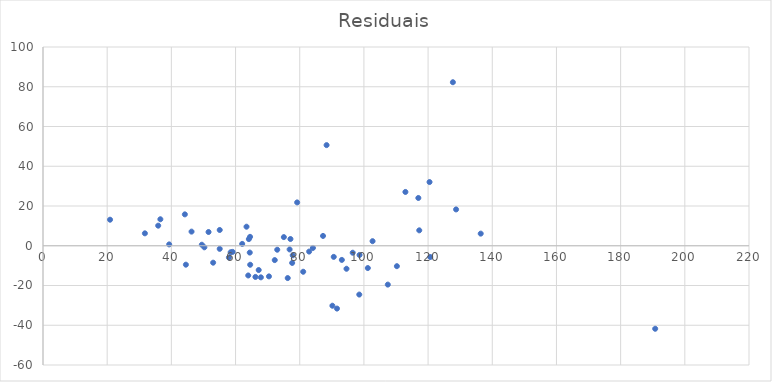
| Category | Residuais |
|---|---|
| 55.066188699001174 | -1.566 |
| 63.956094930219045 | -14.956 |
| 66.1980047067565 | -15.698 |
| 36.57076212687007 | 13.329 |
| 57.92767292637575 | -5.928 |
| 64.56184273352036 | -9.562 |
| 77.10957433300854 | 3.39 |
| 93.12304644218173 | -7.123 |
| 64.52122357599133 | 4.479 |
| 190.7681637023983 | -41.768 |
| 35.89768493258218 | 10.102 |
| 31.74999786179309 | 6.25 |
| 50.284804859293175 | -0.785 |
| 102.69719757712015 | 2.303 |
| 120.45153853825835 | 32.048 |
| 90.60173721675307 | -5.602 |
| 44.204965611738274 | 15.795 |
| 51.585286250029284 | 6.915 |
| 79.19505003350413 | 21.805 |
| 75.0527860079208 | 4.347 |
| 117.24612648807167 | 7.754 |
| 107.44504166414401 | -19.545 |
| 82.9341844807472 | -2.934 |
| 98.64239354237269 | -4.642 |
| 98.56029721267075 | -24.56 |
| 77.64507240898084 | -8.645 |
| 55.066188699001174 | 7.934 |
| 64.14406582131835 | 3.356 |
| 44.52486503165983 | -9.525 |
| 136.39985180315426 | 6.1 |
| 87.25807840237523 | 4.942 |
| 59.09037331740694 | -3.09 |
| 62.06720669880815 | 0.933 |
| 90.17964487403069 | -30.18 |
| 20.896115577614424 | 13.104 |
| 67.89503562386967 | -15.895 |
| 76.84958941550713 | -1.85 |
| 96.50812262630565 | -3.508 |
| 91.60904038251304 | -31.609 |
| 63.41750877604352 | 9.582 |
| 72.99096950542067 | -1.991 |
| 84.10950705946085 | -1.11 |
| 101.2201628903357 | -11.22 |
| 94.57538508020002 | -11.575 |
| 120.67127350312586 | -5.671 |
| 49.49671109148763 | 0.503 |
| 58.47724766828028 | -3.277 |
| 64.43114155701531 | -3.431 |
| 128.72107197364394 | 18.279 |
| 127.72754703283574 | 82.272 |
| 76.2588471894748 | -16.259 |
| 110.27541808378311 | -10.275 |
| 53.0191986520664 | -8.519 |
| 70.41186499848467 | -15.412 |
| 46.29007168898378 | 7.11 |
| 72.2177021931805 | -7.218 |
| 77.81895525430508 | -4.819 |
| 39.32210491768898 | 0.678 |
| 116.96348550217185 | 24.037 |
| 81.08230466496161 | -13.082 |
| 88.36930174726803 | 50.631 |
| 112.93363878165177 | 27.066 |
| 67.21366305226255 | -12.214 |